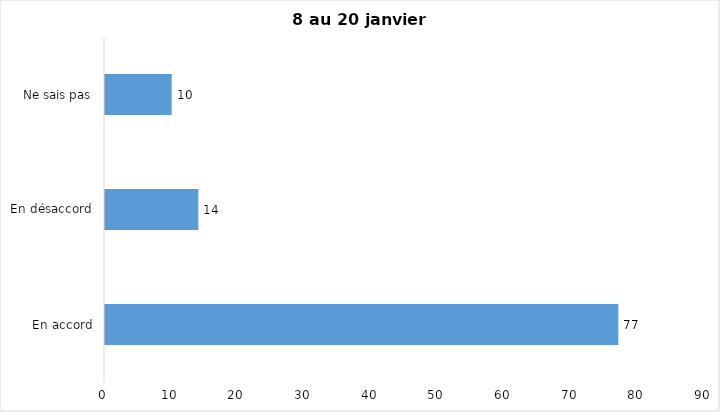
| Category | J’ai l’intention de recevoir le vaccin contre la COVID-19 lorsqu’il
sera disponible |
|---|---|
| En accord | 77 |
| En désaccord | 14 |
| Ne sais pas | 10 |